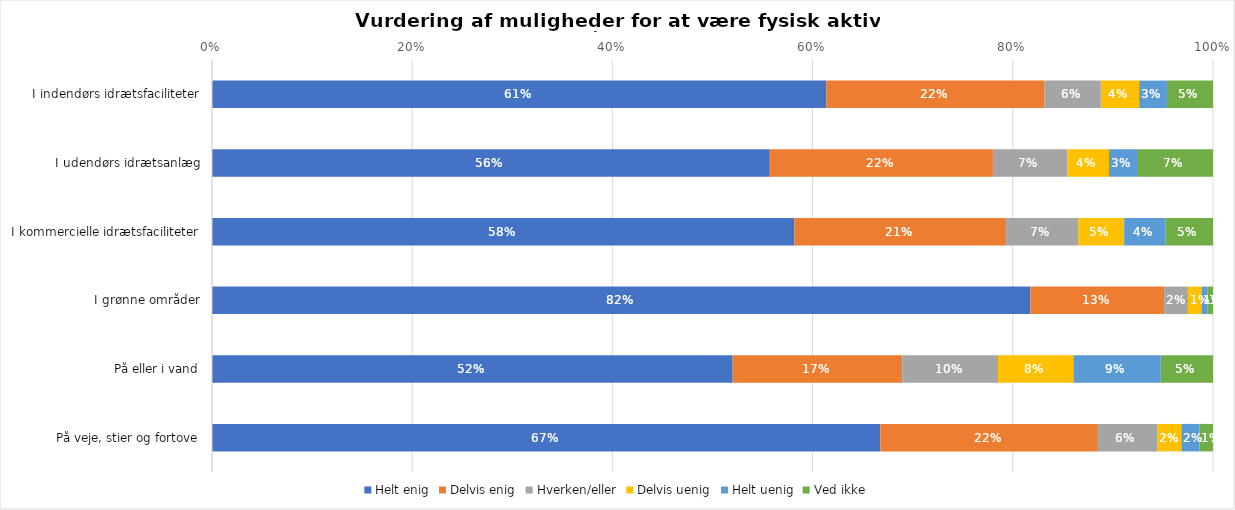
| Category | Helt enig | Delvis enig | Hverken/eller | Delvis uenig | Helt uenig | Ved ikke |
|---|---|---|---|---|---|---|
| I indendørs idrætsfaciliteter | 0.614 | 0.218 | 0.056 | 0.038 | 0.028 | 0.046 |
| I udendørs idrætsanlæg | 0.557 | 0.223 | 0.074 | 0.042 | 0.029 | 0.075 |
| I kommercielle idrætsfaciliteter | 0.582 | 0.212 | 0.072 | 0.046 | 0.042 | 0.047 |
| I grønne områder | 0.818 | 0.134 | 0.024 | 0.014 | 0.006 | 0.006 |
| På eller i vand | 0.52 | 0.169 | 0.096 | 0.075 | 0.087 | 0.052 |
| På veje, stier og fortove | 0.668 | 0.217 | 0.059 | 0.024 | 0.018 | 0.014 |